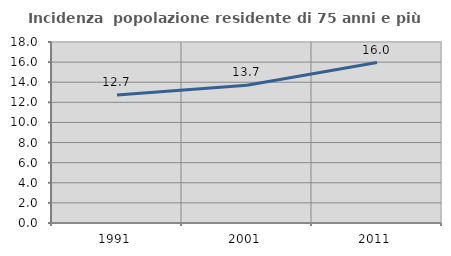
| Category | Incidenza  popolazione residente di 75 anni e più |
|---|---|
| 1991.0 | 12.732 |
| 2001.0 | 13.695 |
| 2011.0 | 15.955 |